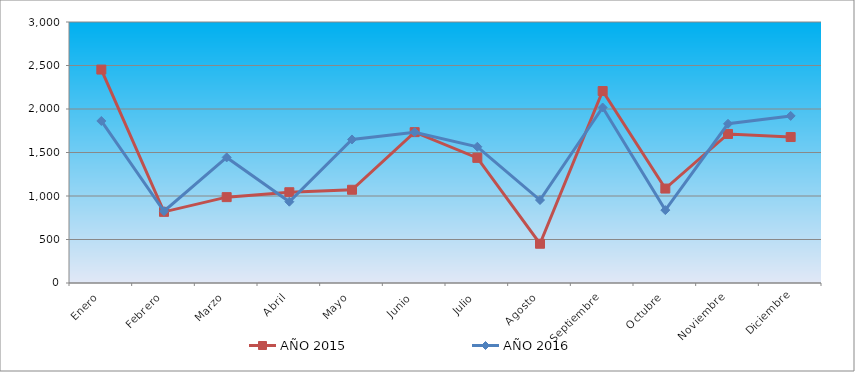
| Category | AÑO 2015 | AÑO 2016 |
|---|---|---|
| Enero | 2453.242 | 1862.493 |
| Febrero | 817.747 | 824.91 |
| Marzo | 986.936 | 1443.593 |
| Abril | 1043.333 | 934.469 |
| Mayo | 1071.531 | 1649.82 |
| Junio | 1734.188 | 1733.6 |
| Julio | 1438.107 | 1566.04 |
| Agosto | 451.171 | 953.802 |
| Septiembre | 2206.508 | 2017.163 |
| Octubre | 1085.63 | 837.799 |
| Noviembre | 1713.039 | 1830.269 |
| Diciembre | 1677.792 | 1920.494 |